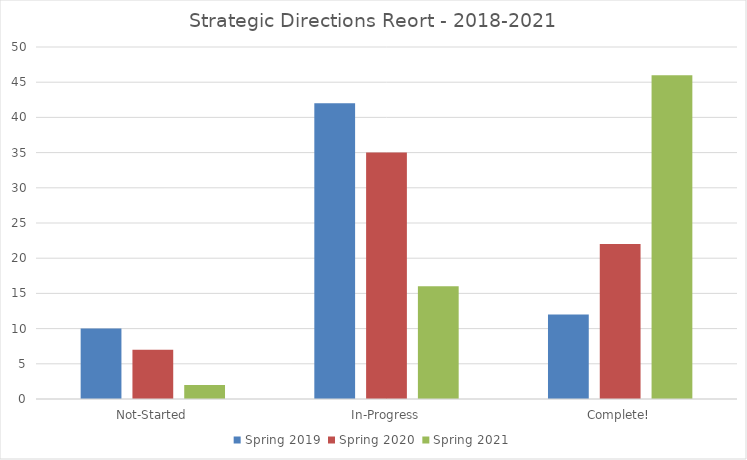
| Category | Spring 2019 | Spring 2020 | Spring 2021 |
|---|---|---|---|
| Not-Started | 10 | 7 | 2 |
| In-Progress | 42 | 35 | 16 |
| Complete! | 12 | 22 | 46 |